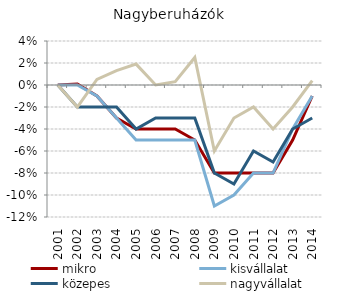
| Category | mikro | kisvállalat | közepes | nagyvállalat |
|---|---|---|---|---|
| 2001.0 | 0 | 0 | 0 | 0 |
| 2002.0 | 0.001 | 0 | -0.02 | -0.02 |
| 2003.0 | -0.01 | -0.01 | -0.02 | 0.005 |
| 2004.0 | -0.03 | -0.03 | -0.02 | 0.013 |
| 2005.0 | -0.04 | -0.05 | -0.04 | 0.019 |
| 2006.0 | -0.04 | -0.05 | -0.03 | 0 |
| 2007.0 | -0.04 | -0.05 | -0.03 | 0.003 |
| 2008.0 | -0.05 | -0.05 | -0.03 | 0.025 |
| 2009.0 | -0.08 | -0.11 | -0.08 | -0.06 |
| 2010.0 | -0.08 | -0.1 | -0.09 | -0.03 |
| 2011.0 | -0.08 | -0.08 | -0.06 | -0.02 |
| 2012.0 | -0.08 | -0.08 | -0.07 | -0.04 |
| 2013.0 | -0.05 | -0.04 | -0.04 | -0.02 |
| 2014.0 | -0.01 | -0.01 | -0.03 | 0.004 |